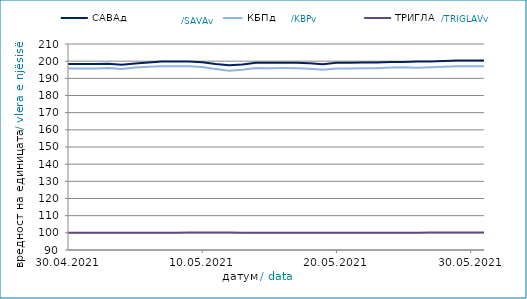
| Category | САВАд | КБПд | ТРИГЛАВд |
|---|---|---|---|
| 2021-04-30 | 198.4 | 195.733 | 100.062 |
| 2021-05-01 | 198.406 | 195.74 | 100.07 |
| 2021-05-02 | 198.412 | 195.747 | 100.078 |
| 2021-05-03 | 198.557 | 196.019 | 100.086 |
| 2021-05-04 | 197.979 | 195.509 | 100.094 |
| 2021-05-05 | 198.636 | 196.253 | 100.09 |
| 2021-05-06 | 199.249 | 196.75 | 100.098 |
| 2021-05-07 | 199.734 | 197.011 | 100.106 |
| 2021-05-08 | 199.744 | 197.026 | 100.115 |
| 2021-05-09 | 199.749 | 197.032 | 100.123 |
| 2021-05-10 | 199.354 | 196.556 | 100.13 |
| 2021-05-11 | 198.357 | 195.498 | 100.13 |
| 2021-05-12 | 197.577 | 194.422 | 100.13 |
| 2021-05-13 | 198.023 | 195.055 | 100.077 |
| 2021-05-14 | 199.049 | 195.998 | 100.083 |
| 2021-05-15 | 199.006 | 195.946 | 100.067 |
| 2021-05-16 | 199.012 | 195.953 | 100.075 |
| 2021-05-17 | 199.082 | 195.823 | 100.083 |
| 2021-05-18 | 198.852 | 195.593 | 100.061 |
| 2021-05-19 | 198.217 | 194.988 | 100.055 |
| 2021-05-20 | 199.124 | 195.731 | 100.053 |
| 2021-05-21 | 199.137 | 195.787 | 100.06 |
| 2021-05-22 | 199.203 | 195.861 | 100.067 |
| 2021-05-23 | 199.209 | 195.868 | 100.075 |
| 2021-05-24 | 199.58 | 196.373 | 100.082 |
| 2021-05-25 | 199.556 | 196.387 | 100.091 |
| 2021-05-26 | 199.751 | 196.137 | 100.109 |
| 2021-05-27 | 199.834 | 196.398 | 100.15 |
| 2021-05-28 | 200.157 | 196.706 | 100.183 |
| 2021-05-29 | 200.429 | 197.043 | 100.237 |
| 2021-05-30 | 200.435 | 197.05 | 100.244 |
| 2021-05-31 | 200.349 | 197.083 | 100.245 |